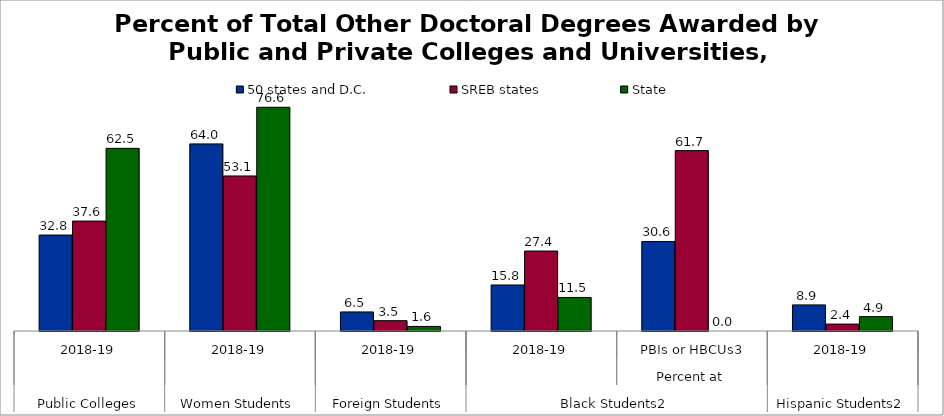
| Category | 50 states and D.C. | SREB states | State |
|---|---|---|---|
| 0 | 32.834 | 37.621 | 62.5 |
| 1 | 64.023 | 53.055 | 76.562 |
| 2 | 6.528 | 3.537 | 1.562 |
| 3 | 15.752 | 27.365 | 11.475 |
| 4 | 30.634 | 61.728 | 0 |
| 5 | 8.93 | 2.365 | 4.918 |